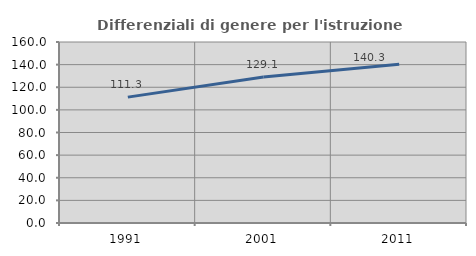
| Category | Differenziali di genere per l'istruzione superiore |
|---|---|
| 1991.0 | 111.284 |
| 2001.0 | 129.057 |
| 2011.0 | 140.253 |